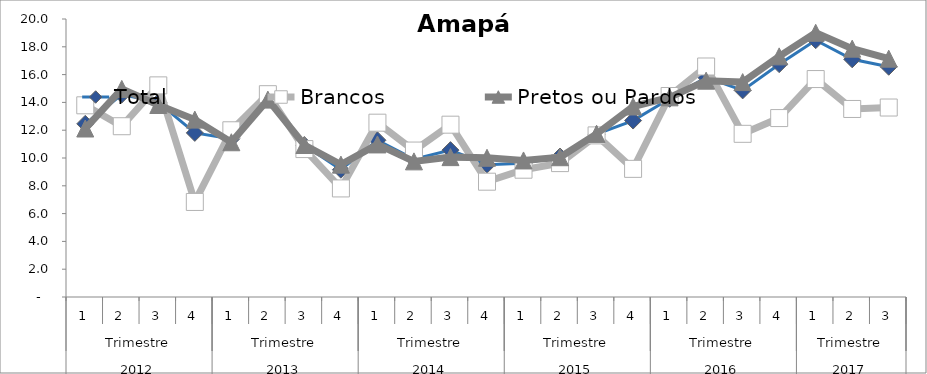
| Category | Total | Brancos | Pretos ou Pardos |
|---|---|---|---|
| 0 | 12.459 | 13.791 | 12.122 |
| 1 | 14.568 | 12.285 | 14.97 |
| 2 | 14.004 | 15.226 | 13.812 |
| 3 | 11.807 | 6.838 | 12.762 |
| 4 | 11.383 | 11.995 | 11.132 |
| 5 | 14.267 | 14.592 | 14.2 |
| 6 | 10.924 | 10.642 | 10.935 |
| 7 | 9.157 | 7.811 | 9.523 |
| 8 | 11.278 | 12.541 | 10.977 |
| 9 | 9.914 | 10.535 | 9.758 |
| 10 | 10.567 | 12.397 | 10.063 |
| 11 | 9.519 | 8.295 | 10.017 |
| 12 | 9.629 | 9.157 | 9.824 |
| 13 | 10.106 | 9.633 | 10.055 |
| 14 | 11.715 | 11.626 | 11.731 |
| 15 | 12.694 | 9.218 | 13.705 |
| 16 | 14.26 | 14.46 | 14.365 |
| 17 | 15.802 | 16.583 | 15.563 |
| 18 | 14.864 | 11.739 | 15.461 |
| 19 | 16.75 | 12.872 | 17.312 |
| 20 | 18.475 | 15.68 | 19.009 |
| 21 | 17.1 | 13.526 | 17.865 |
| 22 | 16.565 | 13.632 | 17.146 |